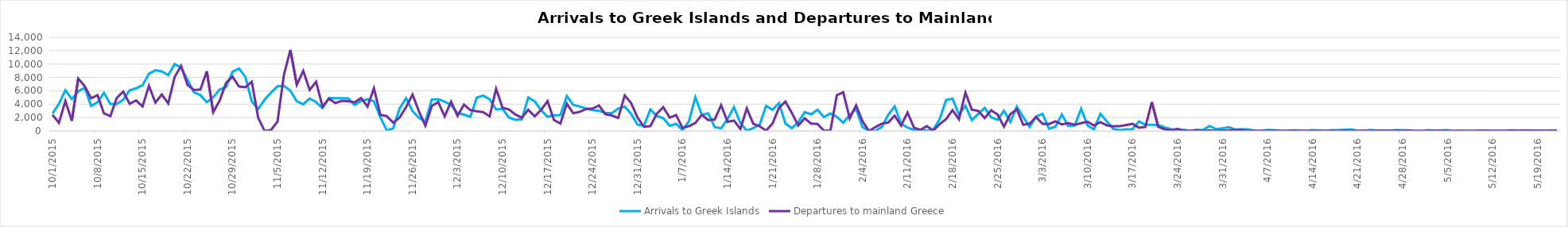
| Category | Arrivals to Greek Islands | Departures to mainland Greece |
|---|---|---|
| 10/1/15 | 2631 | 2409 |
| 10/2/15 | 4055 | 1215 |
| 10/3/15 | 6097 | 4480 |
| 10/4/15 | 4763 | 1513 |
| 10/5/15 | 5909 | 7833 |
| 10/6/15 | 6496 | 6707 |
| 10/7/15 | 3734 | 4886 |
| 10/8/15 | 4295 | 5349 |
| 10/9/15 | 5695 | 2631 |
| 10/10/15 | 4045 | 2214 |
| 10/11/15 | 4034 | 4950 |
| 10/12/15 | 4671 | 5879 |
| 10/13/15 | 6079 | 4052 |
| 10/14/15 | 6380 | 4564 |
| 10/15/15 | 6830 | 3660 |
| 10/16/15 | 8564 | 6743 |
| 10/17/15 | 9063 | 4239 |
| 10/18/15 | 8900 | 5457 |
| 10/19/15 | 8337 | 4119 |
| 10/20/15 | 10006 | 8083 |
| 10/21/15 | 9444 | 9725 |
| 10/22/15 | 7651 | 6896 |
| 10/23/15 | 5762 | 6120 |
| 10/24/15 | 5354 | 6195 |
| 10/25/15 | 4311 | 8916 |
| 10/26/15 | 5049 | 2804 |
| 10/27/15 | 6195 | 4540 |
| 10/28/15 | 6557 | 7191 |
| 10/29/15 | 8847 | 8117 |
| 10/30/15 | 9323 | 6649 |
| 10/31/15 | 8089 | 6537 |
| 11/1/15 | 4400 | 7360 |
| 11/2/15 | 3290 | 1935 |
| 11/3/15 | 4689 | 0 |
| 11/4/15 | 5740 | 142 |
| 11/5/15 | 6679 | 1430 |
| 11/6/15 | 6765 | 8392 |
| 11/7/15 | 6022 | 12116 |
| 11/8/15 | 4425 | 6902 |
| 11/9/15 | 3979 | 8977 |
| 11/10/15 | 4842 | 6133 |
| 11/11/15 | 4296 | 7354 |
| 11/12/15 | 3425 | 3650 |
| 11/13/15 | 4909 | 4820 |
| 11/14/15 | 4884 | 4171 |
| 11/15/15 | 4891 | 4497 |
| 11/16/15 | 4873 | 4442 |
| 11/17/15 | 3873 | 4289 |
| 11/18/15 | 4499 | 4927 |
| 11/19/15 | 4737 | 3644 |
| 11/20/15 | 4432 | 6389 |
| 11/21/15 | 2020 | 2401 |
| 11/22/15 | 76 | 2214 |
| 11/23/15 | 409 | 1245 |
| 11/24/15 | 3383 | 2006 |
| 11/25/15 | 4889 | 3565 |
| 11/26/15 | 2973 | 5435 |
| 11/27/15 | 1961 | 2932 |
| 11/28/15 | 1420 | 778 |
| 11/29/15 | 4703 | 3736 |
| 11/30/15 | 4744 | 4318 |
| 12/1/15 | 4386 | 2181 |
| 12/2/15 | 3863 | 4384 |
| 12/3/15 | 2671 | 2255 |
| 12/4/15 | 2435 | 3934 |
| 12/5/15 | 2110 | 3115 |
| 12/6/15 | 4978 | 2943 |
| 12/7/15 | 5287 | 2810 |
| 12/8/15 | 4721 | 2189 |
| 12/9/15 | 3203 | 6316 |
| 12/10/15 | 3308 | 3456 |
| 12/11/15 | 1999 | 3219 |
| 12/12/15 | 1671 | 2453 |
| 12/13/15 | 1738 | 1976 |
| 12/14/15 | 5005 | 3175 |
| 12/15/15 | 4421 | 2191 |
| 12/16/15 | 3105 | 3137 |
| 12/17/15 | 2135 | 4461 |
| 12/18/15 | 2330 | 1638 |
| 12/19/15 | 2373 | 1110 |
| 12/20/15 | 5223 | 4070 |
| 12/21/15 | 3904 | 2652 |
| 12/22/15 | 3668 | 2864 |
| 12/23/15 | 3354 | 3278 |
| 12/24/15 | 3110 | 3349 |
| 12/25/15 | 3008 | 3806 |
| 12/26/15 | 2710 | 2498 |
| 12/27/15 | 2678 | 2311 |
| 12/28/15 | 3337 | 1946 |
| 12/29/15 | 3643 | 5309 |
| 12/30/15 | 2552 | 4178 |
| 12/31/15 | 948 | 2009 |
| 1/1/16 | 828 | 623 |
| 1/2/16 | 3203 | 720 |
| 1/3/16 | 2241 | 2569 |
| 1/4/16 | 1917 | 3563 |
| 1/5/16 | 779 | 1998 |
| 1/6/16 | 1067 | 2377 |
| 1/7/16 | 119 | 463 |
| 1/8/16 | 1475 | 716 |
| 1/9/16 | 5050 | 1203 |
| 1/10/16 | 2410 | 2417 |
| 1/11/16 | 2645 | 1621 |
| 1/12/16 | 571 | 1701 |
| 1/13/16 | 408 | 3861 |
| 1/14/16 | 1792 | 1378 |
| 1/15/16 | 3564 | 1551 |
| 1/16/16 | 1188 | 301 |
| 1/17/16 | 39 | 3378 |
| 1/18/16 | 435 | 1078 |
| 1/19/16 | 964 | 695 |
| 1/20/16 | 3748 | 50 |
| 1/21/16 | 3166 | 1108 |
| 1/22/16 | 4176 | 3451 |
| 1/23/16 | 1124 | 4397 |
| 1/24/16 | 418 | 2706 |
| 1/25/16 | 1295 | 819 |
| 1/26/16 | 2808 | 1887 |
| 1/27/16 | 2488 | 1098 |
| 1/28/16 | 3180 | 1046 |
| 1/29/16 | 2076 | 40 |
| 1/30/16 | 2623 | 53 |
| 1/31/16 | 2105 | 5342 |
| 2/1/16 | 1244 | 5783 |
| 2/2/16 | 2368 | 1878 |
| 2/3/16 | 3299 | 3829 |
| 2/4/16 | 565 | 1436 |
| 2/5/16 | 38 | 0 |
| 2/6/16 | 7 | 578 |
| 2/7/16 | 608 | 1097 |
| 2/8/16 | 2418 | 1259 |
| 2/9/16 | 3676 | 2283 |
| 2/10/16 | 1071 | 793 |
| 2/11/16 | 502 | 2756 |
| 2/12/16 | 123 | 496 |
| 2/13/16 | 186 | 161 |
| 2/14/16 | 51 | 724 |
| 2/15/16 | 181 | 65 |
| 2/16/16 | 1783 | 1024 |
| 2/17/16 | 4611 | 1772 |
| 2/18/16 | 4824 | 3118 |
| 2/19/16 | 2440 | 1731 |
| 2/20/16 | 3772 | 5738 |
| 2/21/16 | 1618 | 3180 |
| 2/22/16 | 2545 | 3002 |
| 2/23/16 | 3474 | 1927 |
| 2/24/16 | 2044 | 3086 |
| 2/25/16 | 1675 | 2468 |
| 2/26/16 | 3021 | 649 |
| 2/27/16 | 1355 | 2525 |
| 2/28/16 | 3651 | 3234 |
| 2/29/16 | 2072 | 920 |
| 3/1/16 | 609 | 1107 |
| 3/2/16 | 2162 | 2073 |
| 3/3/16 | 2569 | 1061 |
| 3/4/16 | 332 | 1035 |
| 3/5/16 | 630 | 1444 |
| 3/6/16 | 2480 | 980 |
| 3/7/16 | 728 | 1171 |
| 3/8/16 | 811 | 922 |
| 3/9/16 | 3340 | 1169 |
| 3/10/16 | 835 | 1381 |
| 3/11/16 | 232 | 810 |
| 3/12/16 | 2578 | 1326 |
| 3/13/16 | 1418 | 831 |
| 3/14/16 | 301 | 693 |
| 3/15/16 | 128 | 721 |
| 3/16/16 | 252 | 882 |
| 3/17/16 | 263 | 1068 |
| 3/18/16 | 1431 | 489 |
| 3/19/16 | 926 | 608 |
| 3/20/16 | 931 | 4314 |
| 3/21/16 | 880 | 616 |
| 3/22/16 | 539 | 254 |
| 3/23/16 | 269 | 95 |
| 3/24/16 | 83 | 316 |
| 3/25/16 | 177 | 22 |
| 3/26/16 | 5 | 25 |
| 3/27/16 | 144 | 113 |
| 3/28/16 | 161 | 0 |
| 3/29/16 | 741 | 76 |
| 3/30/16 | 267 | 11 |
| 3/31/16 | 401 | 68 |
| 4/1/16 | 555 | 102 |
| 4/2/16 | 231 | 132 |
| 4/3/16 | 262 | 105 |
| 4/4/16 | 228 | 0 |
| 4/5/16 | 28 | 31 |
| 4/6/16 | 70 | 7 |
| 4/7/16 | 157 | 32 |
| 4/8/16 | 116 | 17 |
| 4/9/16 | 59 | 14 |
| 4/10/16 | 0 | 16 |
| 4/11/16 | 75 | 64 |
| 4/12/16 | 101 | 5 |
| 4/13/16 | 30 | 10 |
| 4/14/16 | 106 | 36 |
| 4/15/16 | 79 | 0 |
| 4/16/16 | 55 | 0 |
| 4/17/16 | 107 | 34 |
| 4/18/16 | 107 | 9 |
| 4/19/16 | 178 | 39 |
| 4/20/16 | 233 | 7 |
| 4/21/16 | 49 | 7 |
| 4/22/16 | 34 | 16 |
| 4/23/16 | 137 | 0 |
| 4/24/16 | 52 | 51 |
| 4/25/16 | 0 | 54 |
| 4/26/16 | 62 | 17 |
| 4/27/16 | 108 | 52 |
| 4/28/16 | 110 | 16 |
| 4/29/16 | 90 | 56 |
| 4/30/16 | 0 | 4 |
| 5/1/16 | 0 | 0 |
| 5/2/16 | 123 | 25 |
| 5/3/16 | 53 | 34 |
| 5/4/16 | 87 | 41 |
| 5/5/16 | 123 | 37 |
| 5/6/16 | 14 | 1 |
| 5/7/16 | 48 | 0 |
| 5/8/16 | 37 | 0 |
| 5/9/16 | 42 | 5 |
| 5/10/16 | 63 | 46 |
| 5/11/16 | 73 | 40 |
| 5/12/16 | 11 | 39 |
| 5/13/16 | 6 | 31 |
| 5/14/16 | 8 | 22 |
| 5/15/16 | 47 | 75 |
| 5/16/16 | 16 | 51 |
| 5/17/16 | 24 | 88 |
| 5/18/16 | 98 | 64 |
| 5/19/16 | 14 | 62 |
| 5/20/16 | 35 | 39 |
| 5/21/16 | 76 | 31 |
| 5/22/16 | 50 | 93 |